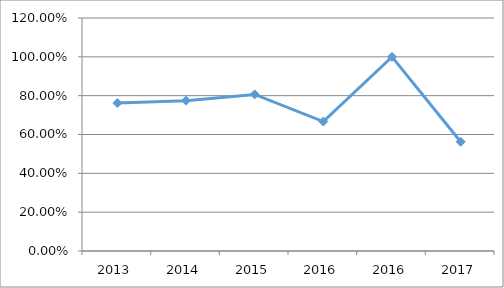
| Category | REAU-E5O07 |
|---|---|
| 2013.0 | 0.762 |
| 2014.0 | 0.774 |
| 2015.0 | 0.806 |
| 2016.0 | 0.667 |
| 2016.0 | 1 |
| 2017.0 | 0.562 |